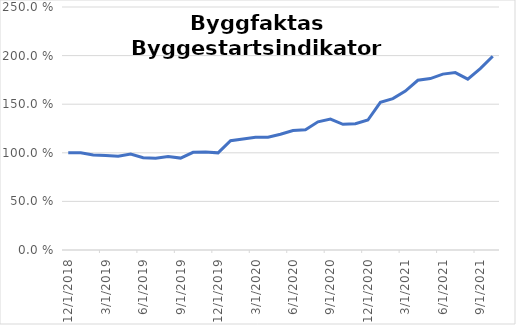
| Category | Trendlinjen |
|---|---|
| 12/1/18 | 1 |
| 1/1/19 | 1 |
| 2/1/19 | 0.978 |
| 3/1/19 | 0.971 |
| 4/1/19 | 0.965 |
| 5/1/19 | 0.987 |
| 6/1/19 | 0.949 |
| 7/1/19 | 0.944 |
| 8/1/19 | 0.962 |
| 9/1/19 | 0.946 |
| 10/1/19 | 1.005 |
| 11/1/19 | 1.008 |
| 12/1/19 | 0.999 |
| 1/1/20 | 1.125 |
| 2/1/20 | 1.143 |
| 3/1/20 | 1.16 |
| 4/1/20 | 1.16 |
| 5/1/20 | 1.191 |
| 6/1/20 | 1.229 |
| 7/1/20 | 1.238 |
| 8/1/20 | 1.319 |
| 9/1/20 | 1.347 |
| 10/1/20 | 1.293 |
| 11/1/20 | 1.3 |
| 12/1/20 | 1.337 |
| 1/1/21 | 1.519 |
| 2/1/21 | 1.558 |
| 3/1/21 | 1.635 |
| 4/1/21 | 1.746 |
| 5/1/21 | 1.763 |
| 6/1/21 | 1.81 |
| 7/1/21 | 1.826 |
| 8/1/21 | 1.758 |
| 9/1/21 | 1.865 |
| 10/1/21 | 1.993 |